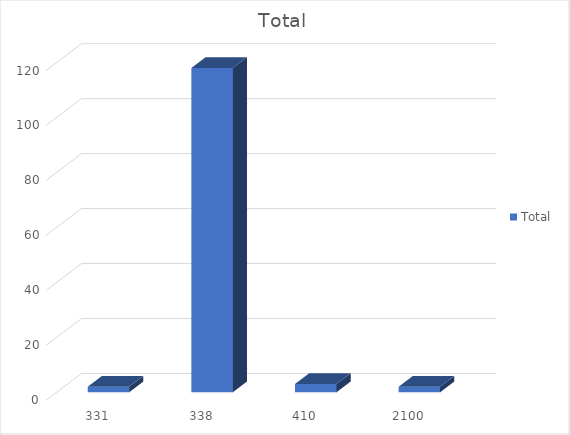
| Category | Total |
|---|---|
| 331 | 2 |
| 338 | 118 |
| 410 | 3 |
| 2100 | 2 |